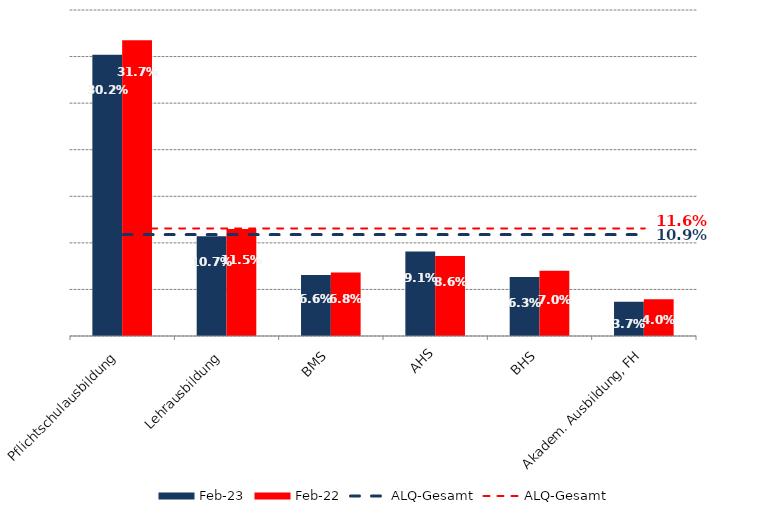
| Category | Feb 23 | Feb 22 |
|---|---|---|
| Pflichtschulausbildung | 0.302 | 0.317 |
| Lehrausbildung | 0.107 | 0.115 |
| BMS | 0.066 | 0.068 |
| AHS | 0.091 | 0.086 |
| BHS | 0.063 | 0.07 |
| Akadem. Ausbildung, FH | 0.037 | 0.04 |